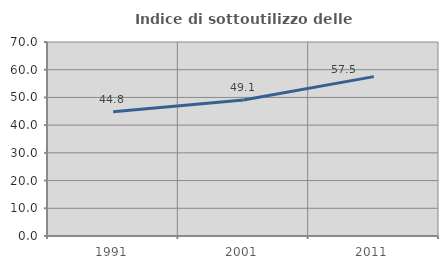
| Category | Indice di sottoutilizzo delle abitazioni  |
|---|---|
| 1991.0 | 44.805 |
| 2001.0 | 49.091 |
| 2011.0 | 57.5 |